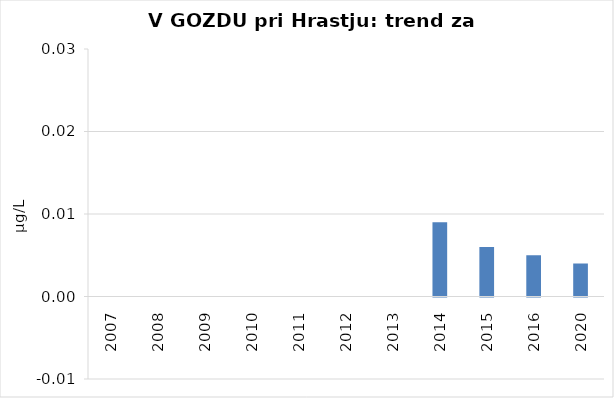
| Category | Vsota |
|---|---|
| 2007 | 0 |
| 2008 | 0 |
| 2009 | 0 |
| 2010 | 0 |
| 2011 | 0 |
| 2012 | 0 |
| 2013 | 0 |
| 2014 | 0.009 |
| 2015 | 0.006 |
| 2016 | 0.005 |
| 2020 | 0.004 |